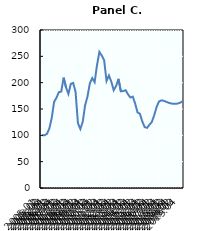
| Category | Metales  |
|---|---|
| 2005:01 | 100 |
| 2005:02 | 100.21 |
| 2005:03 | 102.735 |
| 2005:04 | 112.973 |
| 2006:01 | 132.819 |
| 2006:02 | 163.394 |
| 2006:03 | 171.459 |
| 2006:04 | 181.978 |
| 2007:01 | 183.17 |
| 2007:02 | 209.537 |
| 2007:03 | 191.024 |
| 2007:04 | 178.612 |
| 2008:01 | 197.686 |
| 2008:02 | 199.509 |
| 2008:03 | 182.679 |
| 2008:04 | 123.072 |
| 2009:01 | 111.992 |
| 2009:02 | 125.386 |
| 2009:03 | 156.872 |
| 2009:04 | 173.633 |
| 2010:01 | 198.738 |
| 2010:02 | 208.766 |
| 2010:03 | 200.982 |
| 2010:04 | 233.17 |
| 2011:01 | 258.485 |
| 2011:02 | 251.403 |
| 2011:03 | 242.356 |
| 2011:04 | 203.226 |
| 2012:01 | 213.604 |
| 2012:02 | 201.964 |
| 2012:03 | 185.624 |
| 2012:04 | 193.548 |
| 2013:01 | 207.293 |
| 2013:02 | 183.59 |
| 2013:03 | 184.081 |
| 2013:04 | 185.694 |
| 2014:01 | 177.91 |
| 2014:02 | 171.879 |
| 2014:03 | 173.422 |
| 2014:04 | 160.519 |
| 2015:01 | 143.478 |
| 2015:02 | 140.954 |
| 2015:03 | 126.297 |
| 2015:04 | 115.638 |
| 2016:01 | 114.236 |
| 2016:02 | 120.126 |
| 2016:03 | 125.386 |
| 2016:04 | 138.219 |
| 2017:01 | 153.787 |
| 2017:02 | 164.264 |
| 2017:03 | 166.352 |
| 2017:04 | 165.637 |
| 2018:01 | 163.758 |
| 2018:02 | 161.866 |
| 2018:03 | 160.626 |
| 2018:04 | 159.877 |
| 2019:01 | 159.812 |
| 2019:02 | 160.586 |
| 2019:03 | 162.266 |
| 2019:04 | 164.869 |